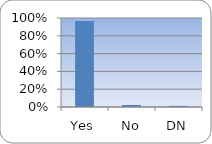
| Category | Series 0 |
|---|---|
| Yes | 0.965 |
| No | 0.022 |
| DN | 0.012 |